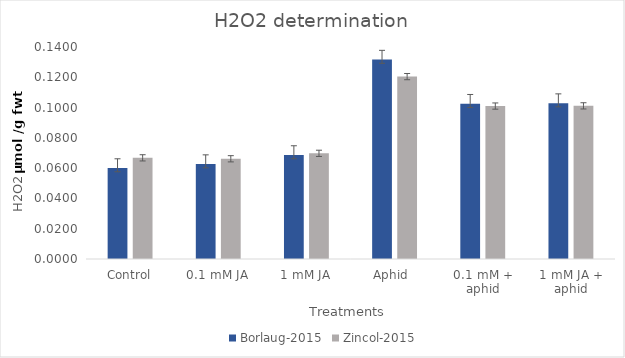
| Category | Borlaug-2015 | Zincol-2015 |
|---|---|---|
| Control | 0.06 | 0.067 |
| 0.1 mM JA | 0.063 | 0.066 |
| 1 mM JA | 0.069 | 0.07 |
| Aphid  | 0.132 | 0.12 |
| 0.1 mM + aphid | 0.103 | 0.101 |
| 1 mM JA + aphid | 0.103 | 0.101 |